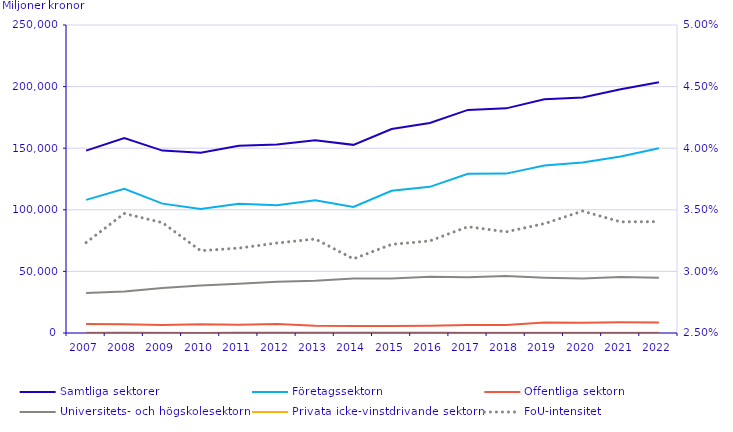
| Category | Samtliga sektorer | Företagssektorn | Offentliga sektorn | Universitets- och högskolesektorn | Privata icke-vinstdrivande sektorn |
|---|---|---|---|---|---|
| 2007 | 148064.803 | 108048.556 | 7315.673 | 32453.731 | 246.844 |
| 2008 | 158165.206 | 117124.137 | 7023.628 | 33707.536 | 309.905 |
| 2009 | 148042.103 | 105006.653 | 6471.565 | 36454.263 | 109.621 |
| 2010 | 146349.97 | 100610.676 | 7129.595 | 38559.281 | 50.418 |
| 2011 | 152041.988 | 104949.767 | 6652.556 | 39956.261 | 483.404 |
| 2012 | 153093.454 | 103778.803 | 7352.629 | 41513.8 | 448.223 |
| 2013 | 156486.555 | 107806.951 | 5857.41 | 42470.925 | 351.269 |
| 2014 | 152707.249 | 102379.01 | 5721.22 | 44239.579 | 367.44 |
| 2015 | 165595.104 | 115399.439 | 5661.546 | 44227.436 | 306.682 |
| 2016 | 170507.534 | 118642.427 | 5804.81 | 45729.68 | 330.616 |
| 2017 | 181102.219 | 129170.926 | 6559.093 | 45156.785 | 215.415 |
| 2018 | 182342.868 | 129374.5 | 6594.323 | 46168.221 | 205.824 |
| 2019 | 189689.467 | 136008.434 | 8559.646 | 44900.714 | 220.672 |
| 2020 | 191161.528 | 138302.77 | 8403.17 | 44232.706 | 222.881 |
| 2021 | 197828.192 | 143319.51 | 8730.8 | 45552.14 | 225.742 |
| 2022 | 203524 | 149930 | 8567 | 44802 | 225 |